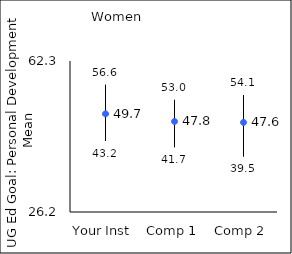
| Category | 25th percentile | 75th percentile | Mean |
|---|---|---|---|
| Your Inst | 43.2 | 56.6 | 49.66 |
| Comp 1 | 41.7 | 53 | 47.84 |
| Comp 2 | 39.5 | 54.1 | 47.62 |